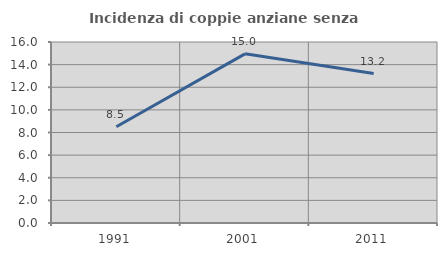
| Category | Incidenza di coppie anziane senza figli  |
|---|---|
| 1991.0 | 8.511 |
| 2001.0 | 14.953 |
| 2011.0 | 13.208 |